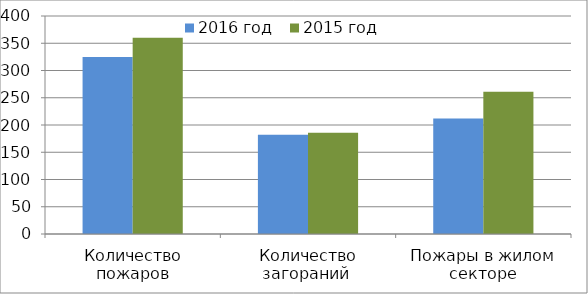
| Category | 2016 год | 2015 год |
|---|---|---|
| Количество пожаров | 325 | 360 |
| Количество загораний  | 182 | 186 |
| Пожары в жилом секторе | 212 | 261 |